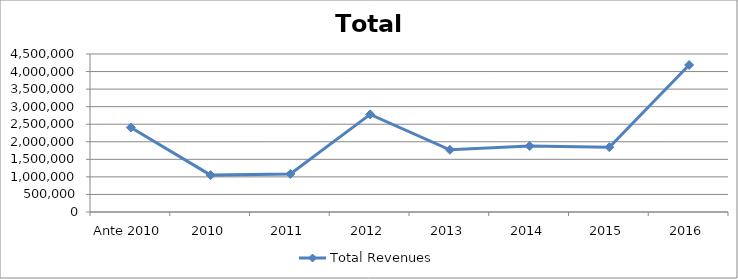
| Category | Total Revenues |
|---|---|
| Ante 2010 | 2406750 |
| 2010 | 1050300 |
| 2011 | 1083248 |
| 2012 | 2780437 |
| 2013 | 1772436.323 |
| 2014 | 1877988.2 |
| 2015 | 1845853 |
| 2016 | 4186826.084 |